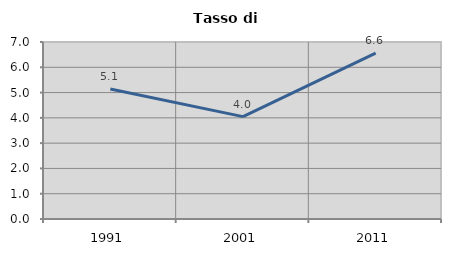
| Category | Tasso di disoccupazione   |
|---|---|
| 1991.0 | 5.141 |
| 2001.0 | 4.048 |
| 2011.0 | 6.556 |